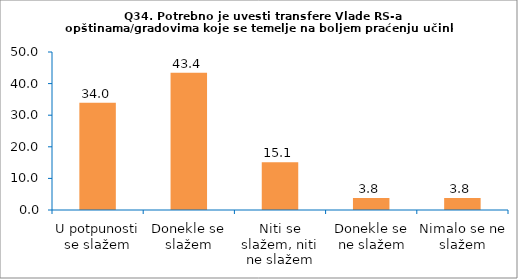
| Category | Series 0 |
|---|---|
| U potpunosti se slažem | 33.962 |
| Donekle se slažem | 43.396 |
| Niti se slažem, niti ne slažem | 15.094 |
| Donekle se ne slažem | 3.774 |
| Nimalo se ne slažem | 3.774 |